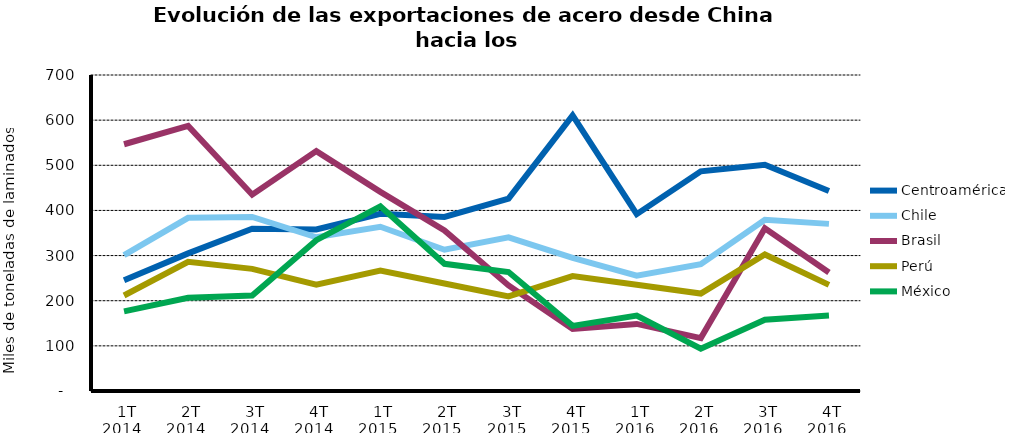
| Category | Centroamérica | Chile | Brasil | Perú | México |
|---|---|---|---|---|---|
| 1T 2014 | 245.469 | 301.163 | 546.588 | 211.586 | 176.474 |
| 2T 2014 | 304.81 | 383.686 | 587.051 | 286.216 | 206.439 |
| 3T 2014 | 359.492 | 385.421 | 434.878 | 270.49 | 211.393 |
| 4T 2014 | 357.944 | 340.56 | 531.409 | 235.555 | 334.047 |
| 1T 2015 | 392.385 | 363.792 | 441.191 | 266.746 | 408.948 |
| 2T 2015 | 385.555 | 312.853 | 355.824 | 238.1 | 281.743 |
| 3T 2015 | 425.99 | 340.258 | 233.812 | 209.722 | 263.503 |
| 4T 2015 | 610.561 | 295.129 | 137.567 | 254.507 | 144.296 |
| 1T 2016 | 391.747 | 255.611 | 148.615 | 235.333 | 167.227 |
| 2T 2016 | 486.701 | 280.74 | 117.262 | 215.907 | 93.772 |
| 3T 2016 | 501.043 | 379.163 | 360.378 | 302.496 | 157.954 |
| 4T 2016 | 443.239 | 370.204 | 262.411 | 235.048 | 166.998 |